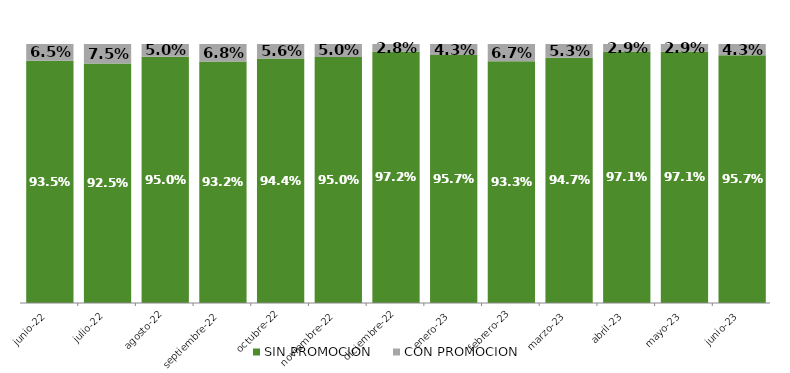
| Category | SIN PROMOCION   | CON PROMOCION   |
|---|---|---|
| 2022-06-01 | 0.935 | 0.065 |
| 2022-07-01 | 0.925 | 0.075 |
| 2022-08-01 | 0.95 | 0.05 |
| 2022-09-01 | 0.932 | 0.068 |
| 2022-10-01 | 0.944 | 0.056 |
| 2022-11-01 | 0.95 | 0.05 |
| 2022-12-01 | 0.972 | 0.028 |
| 2023-01-01 | 0.957 | 0.043 |
| 2023-02-01 | 0.933 | 0.067 |
| 2023-03-01 | 0.947 | 0.053 |
| 2023-04-01 | 0.971 | 0.029 |
| 2023-05-01 | 0.971 | 0.029 |
| 2023-06-01 | 0.957 | 0.043 |